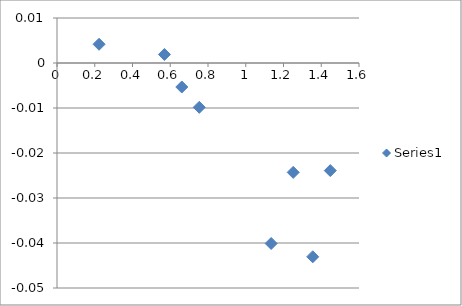
| Category | Series 0 |
|---|---|
| 1.354838709677419 | -0.043 |
| 0.222863741339492 | 0.004 |
| 1.134751773049645 | -0.04 |
| 1.447937131630648 | -0.024 |
| 0.569148936170213 | 0.002 |
| 1.25140712945591 | -0.024 |
| 0.753670473083197 | -0.01 |
| 0.661068702290076 | -0.005 |